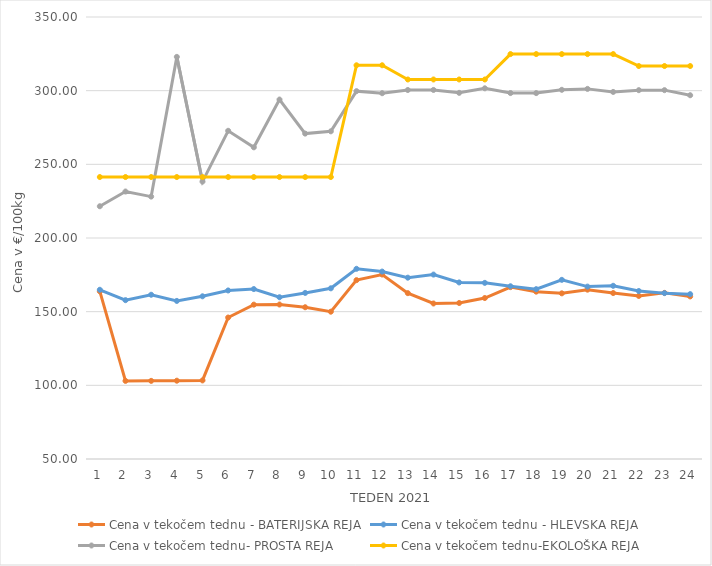
| Category | Cena v tekočem tednu - BATERIJSKA REJA | Cena v tekočem tednu - HLEVSKA REJA | Cena v tekočem tednu- PROSTA REJA | Cena v tekočem tednu-EKOLOŠKA REJA |
|---|---|---|---|---|
| 1.0 | 163.81 | 164.86 | 221.55 | 241.38 |
| 2.0 | 103.02 | 157.81 | 231.55 | 241.38 |
| 3.0 | 103.03 | 161.48 | 228.1 | 241.38 |
| 4.0 | 103.15 | 157.29 | 322.93 | 241.38 |
| 5.0 | 103.34 | 160.43 | 238.28 | 241.38 |
| 6.0 | 146.03 | 164.39 | 272.76 | 241.38 |
| 7.0 | 154.77 | 165.34 | 261.55 | 241.38 |
| 8.0 | 154.86 | 159.79 | 293.97 | 241.38 |
| 9.0 | 153 | 162.73 | 270.86 | 241.38 |
| 10.0 | 149.98 | 165.85 | 272.41 | 241.38 |
| 11.0 | 171.4 | 179.09 | 299.66 | 317.24 |
| 12.0 | 175.2 | 177.21 | 298.27 | 317.24 |
| 13.0 | 162.57 | 173.07 | 300.45 | 307.59 |
| 14.0 | 155.55 | 175.17 | 300.49 | 307.59 |
| 15.0 | 155.88 | 169.83 | 298.52 | 307.59 |
| 16.0 | 159.26 | 169.55 | 301.6 | 307.59 |
| 17.0 | 166.66 | 167.25 | 298.38 | 324.83 |
| 18.0 | 163.58 | 165.28 | 298.35 | 324.83 |
| 19.0 | 162.44 | 171.6 | 300.59 | 324.83 |
| 20.0 | 164.94 | 167.01 | 301.21 | 324.83 |
| 21.0 | 162.64 | 167.56 | 299.14 | 324.83 |
| 22.0 | 160.68 | 164.01 | 300.34 | 316.72 |
| 23.0 | 162.75 | 162.58 | 300.35 | 316.72 |
| 24.0 | 160.34 | 161.89 | 296.9 | 316.72 |